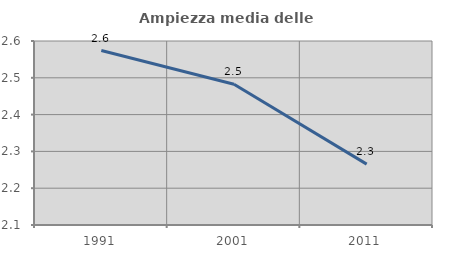
| Category | Ampiezza media delle famiglie |
|---|---|
| 1991.0 | 2.574 |
| 2001.0 | 2.483 |
| 2011.0 | 2.265 |